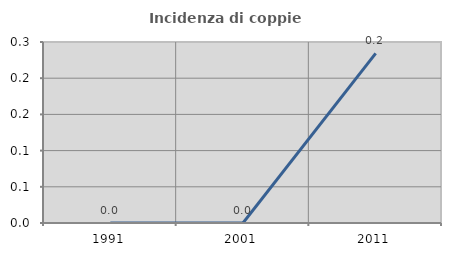
| Category | Incidenza di coppie miste |
|---|---|
| 1991.0 | 0 |
| 2001.0 | 0 |
| 2011.0 | 0.234 |